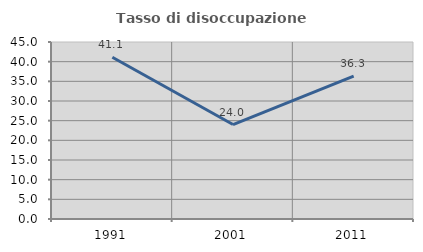
| Category | Tasso di disoccupazione giovanile  |
|---|---|
| 1991.0 | 41.109 |
| 2001.0 | 24.013 |
| 2011.0 | 36.318 |